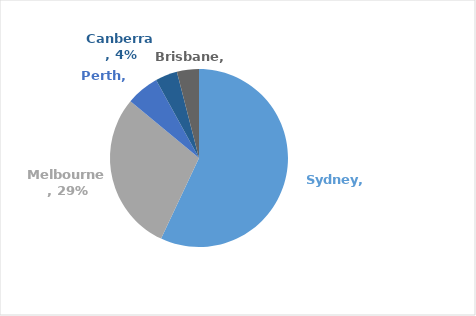
| Category | Series 0 |
|---|---|
| Sydney | 0.57 |
| Melbourne | 0.29 |
| Perth | 0.06 |
| Canberra | 0.04 |
| Brisbane | 0.04 |